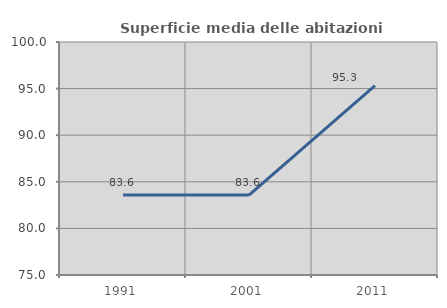
| Category | Superficie media delle abitazioni occupate |
|---|---|
| 1991.0 | 83.59 |
| 2001.0 | 83.574 |
| 2011.0 | 95.33 |